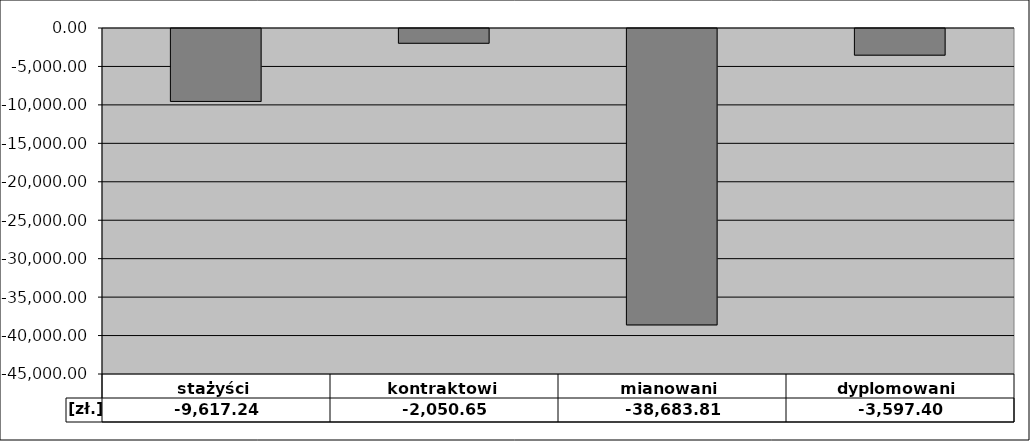
| Category | [zł.] |
|---|---|
| stażyści | -9617.238 |
| kontraktowi | -2050.648 |
| mianowani | -38683.81 |
| dyplomowani | -3597.404 |